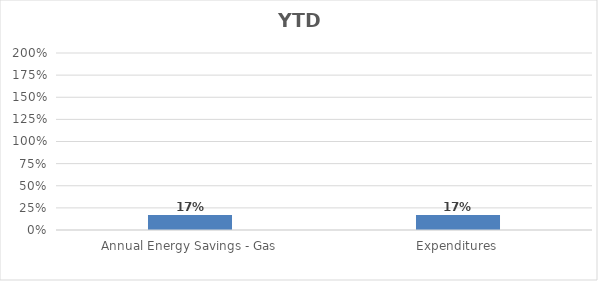
| Category | Series 0 |
|---|---|
| Annual Energy Savings - Gas | 0.17 |
| Expenditures | 0.169 |